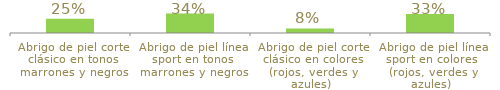
| Category | Series 0 |
|---|---|
| Abrigo de piel corte clásico en tonos marrones y negros | 0.25 |
| Abrigo de piel línea sport en tonos marrones y negros | 0.34 |
| Abrigo de piel corte clásico en colores (rojos, verdes y azules) | 0.08 |
| Abrigo de piel línea sport en colores  (rojos, verdes y azules) | 0.33 |